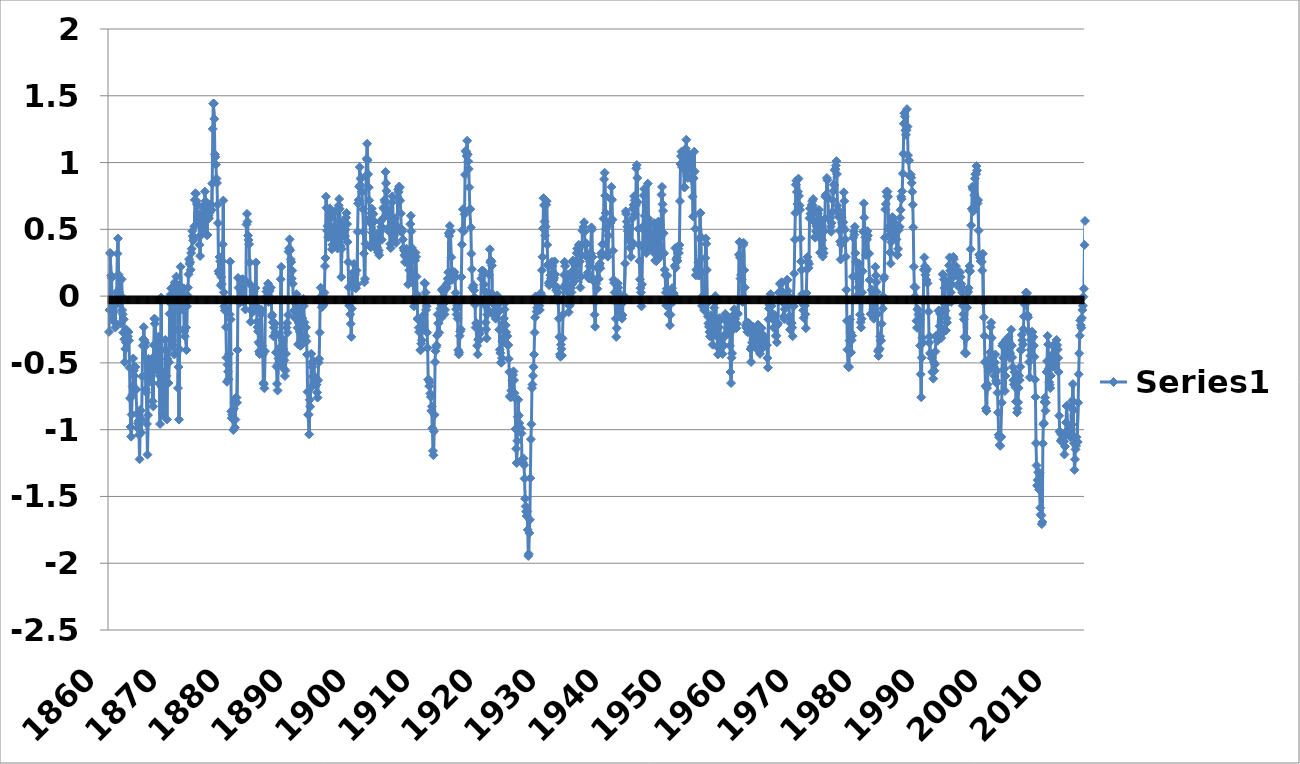
| Category | Series 0 |
|---|---|
| 1860.0 | -0.268 |
| 1860.0 | -0.105 |
| 1860.0 | 0.323 |
| 1860.0 | 0.318 |
| 1860.0 | 0.154 |
| 1860.0 | 0.136 |
| 1860.0 | -0.068 |
| 1860.0 | -0.165 |
| 1860.0 | -0.084 |
| 1860.0 | -0.12 |
| 1860.0 | -0.073 |
| 1860.0 | -0.196 |
| 1861.0 | -0.235 |
| 1861.0 | -0.039 |
| 1861.0 | 0.028 |
| 1861.0 | -0.011 |
| 1861.0 | 0.318 |
| 1861.0 | 0.432 |
| 1861.0 | 0.161 |
| 1861.0 | 0.032 |
| 1861.0 | -0.051 |
| 1861.0 | -0.021 |
| 1861.0 | -0.205 |
| 1861.0 | 0 |
| 1862.0 | 0.126 |
| 1862.0 | -0.105 |
| 1862.0 | -0.136 |
| 1862.0 | -0.273 |
| 1862.0 | -0.174 |
| 1862.0 | -0.323 |
| 1862.0 | -0.495 |
| 1862.0 | -0.395 |
| 1862.0 | -0.346 |
| 1862.0 | -0.251 |
| 1862.0 | -0.336 |
| 1862.0 | -0.328 |
| 1863.0 | -0.301 |
| 1863.0 | -0.269 |
| 1863.0 | -0.333 |
| 1863.0 | -0.536 |
| 1863.0 | -0.765 |
| 1863.0 | -0.979 |
| 1863.0 | -1.052 |
| 1863.0 | -0.887 |
| 1863.0 | -0.74 |
| 1863.0 | -0.677 |
| 1863.0 | -0.467 |
| 1863.0 | -0.557 |
| 1864.0 | -0.596 |
| 1864.0 | -0.531 |
| 1864.0 | -0.53 |
| 1864.0 | -0.7 |
| 1864.0 | -0.699 |
| 1864.0 | -0.881 |
| 1864.0 | -0.987 |
| 1864.0 | -0.953 |
| 1864.0 | -0.937 |
| 1864.0 | -1.038 |
| 1864.0 | -1.222 |
| 1864.0 | -0.853 |
| 1865.0 | -0.859 |
| 1865.0 | -1.023 |
| 1865.0 | -0.924 |
| 1865.0 | -0.601 |
| 1865.0 | -0.371 |
| 1865.0 | -0.323 |
| 1865.0 | -0.232 |
| 1865.0 | -0.329 |
| 1865.0 | -0.379 |
| 1865.0 | -0.349 |
| 1865.0 | -0.697 |
| 1865.0 | -0.721 |
| 1866.0 | -0.957 |
| 1866.0 | -1.187 |
| 1866.0 | -0.891 |
| 1866.0 | -0.47 |
| 1866.0 | -0.601 |
| 1866.0 | -0.585 |
| 1866.0 | -0.593 |
| 1866.0 | -0.559 |
| 1866.0 | -0.641 |
| 1866.0 | -0.513 |
| 1866.0 | -0.467 |
| 1866.0 | -0.787 |
| 1867.0 | -0.826 |
| 1867.0 | -0.367 |
| 1867.0 | -0.169 |
| 1867.0 | -0.207 |
| 1867.0 | -0.174 |
| 1867.0 | -0.553 |
| 1867.0 | -0.527 |
| 1867.0 | -0.428 |
| 1867.0 | -0.51 |
| 1867.0 | -0.415 |
| 1867.0 | -0.303 |
| 1867.0 | -0.656 |
| 1868.0 | -0.596 |
| 1868.0 | -0.958 |
| 1868.0 | -0.333 |
| 1868.0 | -0.011 |
| 1868.0 | -0.404 |
| 1868.0 | -0.684 |
| 1868.0 | -0.79 |
| 1868.0 | -0.887 |
| 1868.0 | -0.74 |
| 1868.0 | -0.677 |
| 1868.0 | -0.565 |
| 1868.0 | -0.328 |
| 1869.0 | -0.596 |
| 1869.0 | -0.597 |
| 1869.0 | -0.924 |
| 1869.0 | -0.47 |
| 1869.0 | -0.404 |
| 1869.0 | -0.651 |
| 1869.0 | -0.495 |
| 1869.0 | -0.133 |
| 1869.0 | -0.051 |
| 1869.0 | 0.012 |
| 1869.0 | 0.058 |
| 1869.0 | -0.36 |
| 1870.0 | -0.334 |
| 1870.0 | -0.367 |
| 1870.0 | -0.267 |
| 1870.0 | -0.24 |
| 1870.0 | -0.437 |
| 1870.0 | 0.104 |
| 1870.0 | 0.096 |
| 1870.0 | -0.001 |
| 1870.0 | 0.146 |
| 1870.0 | 0.044 |
| 1870.0 | -0.008 |
| 1870.0 | -0.689 |
| 1871.0 | -0.531 |
| 1871.0 | -0.925 |
| 1871.0 | -0.399 |
| 1871.0 | 0.022 |
| 1871.0 | 0.219 |
| 1871.0 | 0.071 |
| 1871.0 | -0.068 |
| 1871.0 | -0.1 |
| 1871.0 | -0.018 |
| 1871.0 | -0.021 |
| 1871.0 | 0.058 |
| 1871.0 | -0.262 |
| 1872.0 | -0.301 |
| 1872.0 | -0.236 |
| 1872.0 | -0.235 |
| 1872.0 | -0.404 |
| 1872.0 | -0.076 |
| 1872.0 | 0.005 |
| 1872.0 | 0.063 |
| 1872.0 | 0.163 |
| 1872.0 | 0.277 |
| 1872.0 | 0.241 |
| 1872.0 | 0.255 |
| 1872.0 | 0.197 |
| 1873.0 | 0.322 |
| 1873.0 | 0.355 |
| 1873.0 | 0.487 |
| 1873.0 | 0.449 |
| 1873.0 | 0.416 |
| 1873.0 | 0.432 |
| 1873.0 | 0.522 |
| 1873.0 | 0.721 |
| 1873.0 | 0.769 |
| 1873.0 | 0.766 |
| 1873.0 | 0.714 |
| 1873.0 | 0.689 |
| 1874.0 | 0.683 |
| 1874.0 | 0.552 |
| 1874.0 | 0.586 |
| 1874.0 | 0.613 |
| 1874.0 | 0.384 |
| 1874.0 | 0.3 |
| 1874.0 | 0.457 |
| 1874.0 | 0.458 |
| 1874.0 | 0.54 |
| 1874.0 | 0.668 |
| 1874.0 | 0.616 |
| 1874.0 | 0.558 |
| 1875.0 | 0.486 |
| 1875.0 | 0.65 |
| 1875.0 | 0.783 |
| 1875.0 | 0.711 |
| 1875.0 | 0.613 |
| 1875.0 | 0.694 |
| 1875.0 | 0.457 |
| 1875.0 | 0.458 |
| 1875.0 | 0.671 |
| 1875.0 | 0.602 |
| 1875.0 | 0.583 |
| 1875.0 | 0.624 |
| 1876.0 | 0.683 |
| 1876.0 | 0.683 |
| 1876.0 | 0.684 |
| 1876.0 | 0.646 |
| 1876.0 | 0.843 |
| 1876.0 | 1.252 |
| 1876.0 | 1.441 |
| 1876.0 | 1.442 |
| 1876.0 | 1.327 |
| 1876.0 | 1.061 |
| 1876.0 | 1.042 |
| 1876.0 | 0.985 |
| 1877.0 | 0.88 |
| 1877.0 | 0.847 |
| 1877.0 | 0.684 |
| 1877.0 | 0.547 |
| 1877.0 | 0.187 |
| 1877.0 | 0.169 |
| 1877.0 | 0.293 |
| 1877.0 | 0.261 |
| 1877.0 | 0.08 |
| 1877.0 | 0.143 |
| 1877.0 | 0.091 |
| 1877.0 | 0.263 |
| 1878.0 | 0.388 |
| 1878.0 | 0.716 |
| 1878.0 | 0.028 |
| 1878.0 | -0.076 |
| 1878.0 | -0.109 |
| 1878.0 | -0.093 |
| 1878.0 | -0.232 |
| 1878.0 | -0.461 |
| 1878.0 | -0.641 |
| 1878.0 | -0.513 |
| 1878.0 | -0.565 |
| 1878.0 | -0.623 |
| 1879.0 | -0.432 |
| 1879.0 | -0.137 |
| 1879.0 | 0.258 |
| 1879.0 | -0.175 |
| 1879.0 | -0.863 |
| 1879.0 | -0.914 |
| 1879.0 | -0.888 |
| 1879.0 | -0.854 |
| 1879.0 | -1.002 |
| 1879.0 | -0.842 |
| 1879.0 | -0.795 |
| 1879.0 | -0.984 |
| 1880.0 | -0.924 |
| 1880.0 | -0.761 |
| 1880.0 | -0.759 |
| 1880.0 | -0.798 |
| 1880.0 | -0.404 |
| 1880.0 | 0.136 |
| 1880.0 | 0.063 |
| 1880.0 | -0.034 |
| 1880.0 | -0.051 |
| 1880.0 | -0.021 |
| 1880.0 | 0.058 |
| 1880.0 | 0.033 |
| 1881.0 | 0.027 |
| 1881.0 | 0.125 |
| 1881.0 | 0.126 |
| 1881.0 | -0.043 |
| 1881.0 | -0.043 |
| 1881.0 | 0.104 |
| 1881.0 | -0.035 |
| 1881.0 | -0.1 |
| 1881.0 | 0.113 |
| 1881.0 | 0.536 |
| 1881.0 | 0.616 |
| 1881.0 | 0.558 |
| 1882.0 | 0.454 |
| 1882.0 | 0.42 |
| 1882.0 | 0.389 |
| 1882.0 | 0.252 |
| 1882.0 | 0.088 |
| 1882.0 | -0.192 |
| 1882.0 | -0.101 |
| 1882.0 | -0.034 |
| 1882.0 | -0.051 |
| 1882.0 | -0.12 |
| 1882.0 | -0.008 |
| 1882.0 | 0.033 |
| 1883.0 | 0.06 |
| 1883.0 | -0.039 |
| 1883.0 | 0.061 |
| 1883.0 | 0.252 |
| 1883.0 | -0.076 |
| 1883.0 | -0.192 |
| 1883.0 | -0.232 |
| 1883.0 | -0.264 |
| 1883.0 | -0.346 |
| 1883.0 | -0.415 |
| 1883.0 | -0.434 |
| 1883.0 | -0.36 |
| 1884.0 | -0.137 |
| 1884.0 | -0.105 |
| 1884.0 | -0.103 |
| 1884.0 | -0.371 |
| 1884.0 | -0.437 |
| 1884.0 | -0.651 |
| 1884.0 | -0.659 |
| 1884.0 | -0.69 |
| 1884.0 | -0.412 |
| 1884.0 | -0.021 |
| 1884.0 | -0.008 |
| 1884.0 | 0.033 |
| 1885.0 | 0.06 |
| 1885.0 | 0.059 |
| 1885.0 | 0.094 |
| 1885.0 | -0.043 |
| 1885.0 | 0.055 |
| 1885.0 | 0.038 |
| 1885.0 | 0.063 |
| 1885.0 | 0.064 |
| 1885.0 | -0.018 |
| 1885.0 | -0.153 |
| 1885.0 | -0.139 |
| 1885.0 | -0.196 |
| 1886.0 | -0.301 |
| 1886.0 | -0.236 |
| 1886.0 | -0.202 |
| 1886.0 | -0.207 |
| 1886.0 | -0.273 |
| 1886.0 | -0.421 |
| 1886.0 | -0.527 |
| 1886.0 | -0.657 |
| 1886.0 | -0.707 |
| 1886.0 | -0.513 |
| 1886.0 | -0.467 |
| 1886.0 | -0.393 |
| 1887.0 | -0.498 |
| 1887.0 | -0.301 |
| 1887.0 | 0.126 |
| 1887.0 | 0.219 |
| 1887.0 | -0.371 |
| 1887.0 | -0.421 |
| 1887.0 | -0.331 |
| 1887.0 | -0.395 |
| 1887.0 | -0.543 |
| 1887.0 | -0.481 |
| 1887.0 | -0.598 |
| 1887.0 | -0.557 |
| 1888.0 | -0.432 |
| 1888.0 | -0.236 |
| 1888.0 | -0.202 |
| 1888.0 | -0.273 |
| 1888.0 | -0.141 |
| 1888.0 | 0.333 |
| 1888.0 | 0.358 |
| 1888.0 | 0.425 |
| 1888.0 | 0.343 |
| 1888.0 | 0.274 |
| 1888.0 | 0.255 |
| 1888.0 | 0.132 |
| 1889.0 | 0.191 |
| 1889.0 | 0.092 |
| 1889.0 | -0.038 |
| 1889.0 | -0.109 |
| 1889.0 | -0.043 |
| 1889.0 | -0.159 |
| 1889.0 | -0.167 |
| 1889.0 | -0.1 |
| 1889.0 | 0.015 |
| 1889.0 | -0.087 |
| 1889.0 | -0.237 |
| 1889.0 | -0.36 |
| 1890.0 | -0.203 |
| 1890.0 | -0.105 |
| 1890.0 | -0.267 |
| 1890.0 | -0.371 |
| 1890.0 | -0.371 |
| 1890.0 | -0.323 |
| 1890.0 | -0.199 |
| 1890.0 | -0.165 |
| 1890.0 | -0.051 |
| 1890.0 | -0.021 |
| 1890.0 | -0.073 |
| 1890.0 | -0.196 |
| 1891.0 | -0.334 |
| 1891.0 | -0.301 |
| 1891.0 | -0.235 |
| 1891.0 | -0.339 |
| 1891.0 | -0.437 |
| 1891.0 | -0.717 |
| 1891.0 | -0.888 |
| 1891.0 | -0.887 |
| 1891.0 | -1.035 |
| 1891.0 | -0.776 |
| 1891.0 | -0.828 |
| 1891.0 | -0.689 |
| 1892.0 | -0.432 |
| 1892.0 | -0.498 |
| 1892.0 | -0.53 |
| 1892.0 | -0.601 |
| 1892.0 | -0.601 |
| 1892.0 | -0.487 |
| 1892.0 | -0.659 |
| 1892.0 | -0.657 |
| 1892.0 | -0.609 |
| 1892.0 | -0.645 |
| 1892.0 | -0.664 |
| 1892.0 | -0.721 |
| 1893.0 | -0.76 |
| 1893.0 | -0.629 |
| 1893.0 | -0.497 |
| 1893.0 | -0.47 |
| 1893.0 | -0.273 |
| 1893.0 | -0.028 |
| 1893.0 | 0.063 |
| 1893.0 | -0.001 |
| 1893.0 | -0.084 |
| 1893.0 | -0.054 |
| 1893.0 | -0.073 |
| 1893.0 | -0.065 |
| 1894.0 | -0.006 |
| 1894.0 | 0.027 |
| 1894.0 | 0.225 |
| 1894.0 | 0.285 |
| 1894.0 | 0.744 |
| 1894.0 | 0.661 |
| 1894.0 | 0.49 |
| 1894.0 | 0.524 |
| 1894.0 | 0.441 |
| 1894.0 | 0.536 |
| 1894.0 | 0.648 |
| 1894.0 | 0.657 |
| 1895.0 | 0.618 |
| 1895.0 | 0.584 |
| 1895.0 | 0.52 |
| 1895.0 | 0.35 |
| 1895.0 | 0.384 |
| 1895.0 | 0.432 |
| 1895.0 | 0.424 |
| 1895.0 | 0.392 |
| 1895.0 | 0.507 |
| 1895.0 | 0.635 |
| 1895.0 | 0.484 |
| 1895.0 | 0.394 |
| 1896.0 | 0.454 |
| 1896.0 | 0.453 |
| 1896.0 | 0.356 |
| 1896.0 | 0.383 |
| 1896.0 | 0.679 |
| 1896.0 | 0.727 |
| 1896.0 | 0.654 |
| 1896.0 | 0.556 |
| 1896.0 | 0.376 |
| 1896.0 | 0.143 |
| 1896.0 | 0.353 |
| 1896.0 | 0.46 |
| 1897.0 | 0.519 |
| 1897.0 | 0.486 |
| 1897.0 | 0.52 |
| 1897.0 | 0.449 |
| 1897.0 | 0.449 |
| 1897.0 | 0.497 |
| 1897.0 | 0.588 |
| 1897.0 | 0.622 |
| 1897.0 | 0.54 |
| 1897.0 | 0.405 |
| 1897.0 | 0.255 |
| 1897.0 | 0.066 |
| 1898.0 | -0.071 |
| 1898.0 | -0.039 |
| 1898.0 | -0.136 |
| 1898.0 | -0.207 |
| 1898.0 | -0.305 |
| 1898.0 | -0.093 |
| 1898.0 | 0.096 |
| 1898.0 | 0.13 |
| 1898.0 | 0.179 |
| 1898.0 | 0.241 |
| 1898.0 | 0.156 |
| 1898.0 | 0.164 |
| 1899.0 | 0.06 |
| 1899.0 | 0.059 |
| 1899.0 | 0.192 |
| 1899.0 | 0.088 |
| 1899.0 | 0.482 |
| 1899.0 | 0.694 |
| 1899.0 | 0.719 |
| 1899.0 | 0.819 |
| 1899.0 | 0.966 |
| 1899.0 | 0.832 |
| 1899.0 | 0.878 |
| 1899.0 | 0.886 |
| 1900.0 | 0.782 |
| 1900.0 | 0.781 |
| 1900.0 | 0.651 |
| 1900.0 | 0.482 |
| 1900.0 | 0.318 |
| 1900.0 | 0.104 |
| 1900.0 | 0.129 |
| 1900.0 | 0.392 |
| 1900.0 | 0.901 |
| 1900.0 | 1.029 |
| 1900.0 | 1.141 |
| 1900.0 | 1.017 |
| 1901.0 | 0.913 |
| 1901.0 | 0.814 |
| 1901.0 | 0.717 |
| 1901.0 | 0.58 |
| 1901.0 | 0.548 |
| 1901.0 | 0.366 |
| 1901.0 | 0.621 |
| 1901.0 | 0.655 |
| 1901.0 | 0.474 |
| 1901.0 | 0.569 |
| 1901.0 | 0.616 |
| 1901.0 | 0.558 |
| 1902.0 | 0.454 |
| 1902.0 | 0.42 |
| 1902.0 | 0.389 |
| 1902.0 | 0.383 |
| 1902.0 | 0.351 |
| 1902.0 | 0.366 |
| 1902.0 | 0.424 |
| 1902.0 | 0.327 |
| 1902.0 | 0.343 |
| 1902.0 | 0.307 |
| 1902.0 | 0.484 |
| 1902.0 | 0.558 |
| 1903.0 | 0.486 |
| 1903.0 | 0.519 |
| 1903.0 | 0.422 |
| 1903.0 | 0.514 |
| 1903.0 | 0.58 |
| 1903.0 | 0.661 |
| 1903.0 | 0.654 |
| 1903.0 | 0.721 |
| 1903.0 | 0.704 |
| 1903.0 | 0.93 |
| 1903.0 | 0.845 |
| 1903.0 | 0.788 |
| 1904.0 | 0.618 |
| 1904.0 | 0.617 |
| 1904.0 | 0.651 |
| 1904.0 | 0.514 |
| 1904.0 | 0.482 |
| 1904.0 | 0.497 |
| 1904.0 | 0.391 |
| 1904.0 | 0.36 |
| 1904.0 | 0.474 |
| 1904.0 | 0.7 |
| 1904.0 | 0.747 |
| 1904.0 | 0.591 |
| 1905.0 | 0.585 |
| 1905.0 | 0.42 |
| 1905.0 | 0.454 |
| 1905.0 | 0.58 |
| 1905.0 | 0.482 |
| 1905.0 | 0.399 |
| 1905.0 | 0.49 |
| 1905.0 | 0.524 |
| 1905.0 | 0.736 |
| 1905.0 | 0.799 |
| 1905.0 | 0.78 |
| 1905.0 | 0.821 |
| 1906.0 | 0.814 |
| 1906.0 | 0.716 |
| 1906.0 | 0.618 |
| 1906.0 | 0.482 |
| 1906.0 | 0.482 |
| 1906.0 | 0.497 |
| 1906.0 | 0.424 |
| 1906.0 | 0.36 |
| 1906.0 | 0.343 |
| 1906.0 | 0.307 |
| 1906.0 | 0.255 |
| 1906.0 | 0.296 |
| 1907.0 | 0.322 |
| 1907.0 | 0.355 |
| 1907.0 | 0.323 |
| 1907.0 | 0.252 |
| 1907.0 | 0.088 |
| 1907.0 | 0.268 |
| 1907.0 | 0.194 |
| 1907.0 | 0.327 |
| 1907.0 | 0.54 |
| 1907.0 | 0.602 |
| 1907.0 | 0.484 |
| 1907.0 | 0.361 |
| 1908.0 | 0.158 |
| 1908.0 | 0.125 |
| 1908.0 | 0.094 |
| 1908.0 | -0.076 |
| 1908.0 | -0.01 |
| 1908.0 | 0.268 |
| 1908.0 | 0.326 |
| 1908.0 | 0.294 |
| 1908.0 | 0.146 |
| 1908.0 | 0.012 |
| 1908.0 | -0.172 |
| 1908.0 | -0.164 |
| 1909.0 | -0.235 |
| 1909.0 | -0.269 |
| 1909.0 | -0.267 |
| 1909.0 | -0.404 |
| 1909.0 | -0.404 |
| 1909.0 | -0.356 |
| 1909.0 | -0.331 |
| 1909.0 | -0.198 |
| 1909.0 | -0.215 |
| 1909.0 | -0.251 |
| 1909.0 | -0.139 |
| 1909.0 | 0.099 |
| 1910.0 | 0.093 |
| 1910.0 | 0.027 |
| 1910.0 | -0.103 |
| 1910.0 | -0.076 |
| 1910.0 | -0.273 |
| 1910.0 | -0.389 |
| 1910.0 | -0.626 |
| 1910.0 | -0.625 |
| 1910.0 | -0.674 |
| 1910.0 | -0.645 |
| 1910.0 | -0.729 |
| 1910.0 | -0.754 |
| 1911.0 | -0.859 |
| 1911.0 | -0.826 |
| 1911.0 | -0.989 |
| 1911.0 | -1.159 |
| 1911.0 | -1.191 |
| 1911.0 | -1.012 |
| 1911.0 | -0.888 |
| 1911.0 | -0.493 |
| 1911.0 | -0.412 |
| 1911.0 | -0.382 |
| 1911.0 | -0.369 |
| 1911.0 | -0.295 |
| 1912.0 | -0.137 |
| 1912.0 | -0.203 |
| 1912.0 | -0.202 |
| 1912.0 | -0.273 |
| 1912.0 | -0.141 |
| 1912.0 | -0.093 |
| 1912.0 | -0.167 |
| 1912.0 | -0.067 |
| 1912.0 | 0.048 |
| 1912.0 | 0.044 |
| 1912.0 | 0.058 |
| 1912.0 | 0.033 |
| 1913.0 | -0.039 |
| 1913.0 | -0.137 |
| 1913.0 | -0.103 |
| 1913.0 | -0.043 |
| 1913.0 | 0.055 |
| 1913.0 | 0.071 |
| 1913.0 | 0.096 |
| 1913.0 | 0.13 |
| 1913.0 | 0.179 |
| 1913.0 | 0.471 |
| 1913.0 | 0.452 |
| 1913.0 | 0.525 |
| 1914.0 | 0.486 |
| 1914.0 | 0.486 |
| 1914.0 | 0.29 |
| 1914.0 | 0.121 |
| 1914.0 | 0.187 |
| 1914.0 | 0.136 |
| 1914.0 | 0.161 |
| 1914.0 | 0.13 |
| 1914.0 | 0.179 |
| 1914.0 | 0.143 |
| 1914.0 | 0.025 |
| 1914.0 | -0.098 |
| 1915.0 | -0.137 |
| 1915.0 | -0.072 |
| 1915.0 | -0.169 |
| 1915.0 | -0.404 |
| 1915.0 | -0.437 |
| 1915.0 | -0.421 |
| 1915.0 | -0.298 |
| 1915.0 | -0.264 |
| 1915.0 | -0.248 |
| 1915.0 | 0.143 |
| 1915.0 | 0.386 |
| 1915.0 | 0.493 |
| 1916.0 | 0.65 |
| 1916.0 | 0.65 |
| 1916.0 | 0.487 |
| 1916.0 | 0.613 |
| 1916.0 | 0.908 |
| 1916.0 | 1.088 |
| 1916.0 | 1.08 |
| 1916.0 | 1.049 |
| 1916.0 | 1.163 |
| 1916.0 | 1.061 |
| 1916.0 | 1.009 |
| 1916.0 | 0.952 |
| 1917.0 | 0.814 |
| 1917.0 | 0.65 |
| 1917.0 | 0.651 |
| 1917.0 | 0.514 |
| 1917.0 | 0.318 |
| 1917.0 | 0.202 |
| 1917.0 | 0.063 |
| 1917.0 | 0.064 |
| 1917.0 | 0.08 |
| 1917.0 | 0.044 |
| 1917.0 | -0.008 |
| 1917.0 | -0.065 |
| 1918.0 | -0.235 |
| 1918.0 | -0.203 |
| 1918.0 | -0.202 |
| 1918.0 | -0.371 |
| 1918.0 | -0.437 |
| 1918.0 | -0.323 |
| 1918.0 | -0.331 |
| 1918.0 | -0.329 |
| 1918.0 | -0.281 |
| 1918.0 | -0.251 |
| 1918.0 | -0.04 |
| 1918.0 | 0.132 |
| 1919.0 | 0.191 |
| 1919.0 | 0.191 |
| 1919.0 | 0.159 |
| 1919.0 | 0.186 |
| 1919.0 | 0.088 |
| 1919.0 | 0.038 |
| 1919.0 | -0.068 |
| 1919.0 | -0.198 |
| 1919.0 | -0.248 |
| 1919.0 | -0.317 |
| 1919.0 | -0.139 |
| 1919.0 | -0.032 |
| 1920.0 | -0.104 |
| 1920.0 | 0.027 |
| 1920.0 | 0.159 |
| 1920.0 | 0.35 |
| 1920.0 | 0.252 |
| 1920.0 | 0.268 |
| 1920.0 | 0.26 |
| 1920.0 | 0.228 |
| 1920.0 | 0.015 |
| 1920.0 | -0.054 |
| 1920.0 | -0.139 |
| 1920.0 | -0.131 |
| 1921.0 | -0.039 |
| 1921.0 | -0.137 |
| 1921.0 | -0.169 |
| 1921.0 | -0.076 |
| 1921.0 | -0.01 |
| 1921.0 | 0.005 |
| 1921.0 | -0.068 |
| 1921.0 | -0.1 |
| 1921.0 | -0.117 |
| 1921.0 | -0.251 |
| 1921.0 | -0.401 |
| 1921.0 | -0.426 |
| 1922.0 | -0.498 |
| 1922.0 | -0.498 |
| 1922.0 | -0.464 |
| 1922.0 | -0.339 |
| 1922.0 | -0.207 |
| 1922.0 | -0.257 |
| 1922.0 | -0.167 |
| 1922.0 | -0.1 |
| 1922.0 | -0.051 |
| 1922.0 | -0.218 |
| 1922.0 | -0.27 |
| 1922.0 | -0.295 |
| 1923.0 | -0.301 |
| 1923.0 | -0.367 |
| 1923.0 | -0.366 |
| 1923.0 | -0.47 |
| 1923.0 | -0.568 |
| 1923.0 | -0.749 |
| 1923.0 | -0.757 |
| 1923.0 | -0.756 |
| 1923.0 | -0.707 |
| 1923.0 | -0.71 |
| 1923.0 | -0.631 |
| 1923.0 | -0.59 |
| 1924.0 | -0.563 |
| 1924.0 | -0.629 |
| 1924.0 | -0.727 |
| 1924.0 | -0.765 |
| 1924.0 | -0.994 |
| 1924.0 | -1.143 |
| 1924.0 | -1.249 |
| 1924.0 | -1.084 |
| 1924.0 | -0.904 |
| 1924.0 | -0.776 |
| 1924.0 | -0.893 |
| 1924.0 | -0.951 |
| 1925.0 | -0.99 |
| 1925.0 | -0.99 |
| 1925.0 | -0.989 |
| 1925.0 | -1.028 |
| 1925.0 | -1.224 |
| 1925.0 | -1.242 |
| 1925.0 | -1.249 |
| 1925.0 | -1.215 |
| 1925.0 | -1.265 |
| 1925.0 | -1.366 |
| 1925.0 | -1.517 |
| 1925.0 | -1.574 |
| 1926.0 | -1.613 |
| 1926.0 | -1.647 |
| 1926.0 | -1.612 |
| 1926.0 | -1.749 |
| 1926.0 | -1.946 |
| 1926.0 | -1.931 |
| 1926.0 | -1.774 |
| 1926.0 | -1.675 |
| 1926.0 | -1.363 |
| 1926.0 | -1.071 |
| 1926.0 | -0.959 |
| 1926.0 | -0.689 |
| 1927.0 | -0.662 |
| 1927.0 | -0.597 |
| 1927.0 | -0.53 |
| 1927.0 | -0.437 |
| 1927.0 | -0.273 |
| 1927.0 | -0.159 |
| 1927.0 | -0.003 |
| 1927.0 | -0.034 |
| 1927.0 | -0.117 |
| 1927.0 | -0.087 |
| 1927.0 | -0.106 |
| 1927.0 | -0.065 |
| 1928.0 | -0.039 |
| 1928.0 | -0.072 |
| 1928.0 | -0.103 |
| 1928.0 | -0.011 |
| 1928.0 | 0.023 |
| 1928.0 | 0.005 |
| 1928.0 | 0.194 |
| 1928.0 | 0.294 |
| 1928.0 | 0.507 |
| 1928.0 | 0.733 |
| 1928.0 | 0.681 |
| 1928.0 | 0.558 |
| 1929.0 | 0.454 |
| 1929.0 | 0.519 |
| 1929.0 | 0.684 |
| 1929.0 | 0.711 |
| 1929.0 | 0.384 |
| 1929.0 | 0.235 |
| 1929.0 | 0.227 |
| 1929.0 | 0.097 |
| 1929.0 | 0.08 |
| 1929.0 | 0.11 |
| 1929.0 | 0.156 |
| 1929.0 | 0.132 |
| 1930.0 | 0.158 |
| 1930.0 | 0.256 |
| 1930.0 | 0.225 |
| 1930.0 | 0.088 |
| 1930.0 | 0.121 |
| 1930.0 | 0.136 |
| 1930.0 | 0.26 |
| 1930.0 | 0.163 |
| 1930.0 | -0.018 |
| 1930.0 | 0.044 |
| 1930.0 | -0.008 |
| 1930.0 | 0.066 |
| 1931.0 | 0.027 |
| 1931.0 | -0.039 |
| 1931.0 | -0.169 |
| 1931.0 | -0.306 |
| 1931.0 | -0.437 |
| 1931.0 | -0.454 |
| 1931.0 | -0.363 |
| 1931.0 | -0.395 |
| 1931.0 | -0.445 |
| 1931.0 | -0.317 |
| 1931.0 | -0.139 |
| 1931.0 | 0.066 |
| 1932.0 | 0.158 |
| 1932.0 | 0.256 |
| 1932.0 | 0.225 |
| 1932.0 | 0.088 |
| 1932.0 | 0.088 |
| 1932.0 | 0.038 |
| 1932.0 | 0.063 |
| 1932.0 | 0.163 |
| 1932.0 | 0.146 |
| 1932.0 | -0.12 |
| 1932.0 | -0.073 |
| 1932.0 | -0.065 |
| 1933.0 | -0.006 |
| 1933.0 | 0.059 |
| 1933.0 | 0.028 |
| 1933.0 | 0.088 |
| 1933.0 | 0.252 |
| 1933.0 | 0.268 |
| 1933.0 | 0.194 |
| 1933.0 | 0.13 |
| 1933.0 | 0.113 |
| 1933.0 | 0.176 |
| 1933.0 | 0.189 |
| 1933.0 | 0.23 |
| 1934.0 | 0.322 |
| 1934.0 | 0.355 |
| 1934.0 | 0.356 |
| 1934.0 | 0.35 |
| 1934.0 | 0.384 |
| 1934.0 | 0.366 |
| 1934.0 | 0.26 |
| 1934.0 | 0.064 |
| 1934.0 | 0.146 |
| 1934.0 | 0.307 |
| 1934.0 | 0.386 |
| 1934.0 | 0.493 |
| 1935.0 | 0.486 |
| 1935.0 | 0.519 |
| 1935.0 | 0.553 |
| 1935.0 | 0.482 |
| 1935.0 | 0.384 |
| 1935.0 | 0.3 |
| 1935.0 | 0.391 |
| 1935.0 | 0.392 |
| 1935.0 | 0.31 |
| 1935.0 | 0.176 |
| 1935.0 | 0.156 |
| 1935.0 | 0.132 |
| 1936.0 | 0.224 |
| 1936.0 | 0.256 |
| 1936.0 | 0.323 |
| 1936.0 | 0.318 |
| 1936.0 | 0.515 |
| 1936.0 | 0.497 |
| 1936.0 | 0.293 |
| 1936.0 | 0.13 |
| 1936.0 | 0.113 |
| 1936.0 | -0.021 |
| 1936.0 | -0.139 |
| 1936.0 | -0.229 |
| 1937.0 | -0.039 |
| 1937.0 | 0.092 |
| 1937.0 | 0.126 |
| 1937.0 | 0.055 |
| 1937.0 | 0.219 |
| 1937.0 | 0.202 |
| 1937.0 | 0.129 |
| 1937.0 | 0.228 |
| 1937.0 | 0.244 |
| 1937.0 | 0.208 |
| 1937.0 | 0.32 |
| 1937.0 | 0.296 |
| 1938.0 | 0.322 |
| 1938.0 | 0.388 |
| 1938.0 | 0.389 |
| 1938.0 | 0.58 |
| 1938.0 | 0.876 |
| 1938.0 | 0.924 |
| 1938.0 | 0.752 |
| 1938.0 | 0.622 |
| 1938.0 | 0.507 |
| 1938.0 | 0.307 |
| 1938.0 | 0.32 |
| 1938.0 | 0.296 |
| 1939.0 | 0.454 |
| 1939.0 | 0.552 |
| 1939.0 | 0.553 |
| 1939.0 | 0.547 |
| 1939.0 | 0.548 |
| 1939.0 | 0.727 |
| 1939.0 | 0.818 |
| 1939.0 | 0.721 |
| 1939.0 | 0.572 |
| 1939.0 | 0.34 |
| 1939.0 | 0.124 |
| 1939.0 | 0.099 |
| 1940.0 | 0.027 |
| 1940.0 | -0.039 |
| 1940.0 | -0.169 |
| 1940.0 | -0.306 |
| 1940.0 | -0.24 |
| 1940.0 | 0.038 |
| 1940.0 | 0.096 |
| 1940.0 | 0.064 |
| 1940.0 | -0.018 |
| 1940.0 | -0.12 |
| 1940.0 | -0.04 |
| 1940.0 | -0.032 |
| 1941.0 | -0.006 |
| 1941.0 | -0.039 |
| 1941.0 | -0.169 |
| 1941.0 | -0.142 |
| 1941.0 | -0.043 |
| 1941.0 | 0.005 |
| 1941.0 | -0.035 |
| 1941.0 | -0.034 |
| 1941.0 | 0.244 |
| 1941.0 | 0.635 |
| 1941.0 | 0.616 |
| 1941.0 | 0.558 |
| 1942.0 | 0.519 |
| 1942.0 | 0.486 |
| 1942.0 | 0.487 |
| 1942.0 | 0.416 |
| 1942.0 | 0.515 |
| 1942.0 | 0.497 |
| 1942.0 | 0.358 |
| 1942.0 | 0.294 |
| 1942.0 | 0.376 |
| 1942.0 | 0.405 |
| 1942.0 | 0.583 |
| 1942.0 | 0.657 |
| 1943.0 | 0.683 |
| 1943.0 | 0.748 |
| 1943.0 | 0.717 |
| 1943.0 | 0.613 |
| 1943.0 | 0.679 |
| 1943.0 | 0.957 |
| 1943.0 | 0.982 |
| 1943.0 | 0.885 |
| 1943.0 | 0.704 |
| 1943.0 | 0.504 |
| 1943.0 | 0.386 |
| 1943.0 | 0.263 |
| 1944.0 | 0.126 |
| 1944.0 | 0.059 |
| 1944.0 | 0.028 |
| 1944.0 | -0.076 |
| 1944.0 | 0.088 |
| 1944.0 | 0.366 |
| 1944.0 | 0.522 |
| 1944.0 | 0.753 |
| 1944.0 | 0.802 |
| 1944.0 | 0.602 |
| 1944.0 | 0.484 |
| 1944.0 | 0.394 |
| 1945.0 | 0.322 |
| 1945.0 | 0.388 |
| 1945.0 | 0.487 |
| 1945.0 | 0.842 |
| 1945.0 | 0.58 |
| 1945.0 | 0.399 |
| 1945.0 | 0.424 |
| 1945.0 | 0.392 |
| 1945.0 | 0.54 |
| 1945.0 | 0.405 |
| 1945.0 | 0.353 |
| 1945.0 | 0.394 |
| 1946.0 | 0.421 |
| 1946.0 | 0.453 |
| 1946.0 | 0.422 |
| 1946.0 | 0.547 |
| 1946.0 | 0.318 |
| 1946.0 | 0.268 |
| 1946.0 | 0.326 |
| 1946.0 | 0.261 |
| 1946.0 | 0.277 |
| 1946.0 | 0.34 |
| 1946.0 | 0.517 |
| 1946.0 | 0.558 |
| 1947.0 | 0.486 |
| 1947.0 | 0.388 |
| 1947.0 | 0.29 |
| 1947.0 | 0.35 |
| 1947.0 | 0.449 |
| 1947.0 | 0.76 |
| 1947.0 | 0.818 |
| 1947.0 | 0.688 |
| 1947.0 | 0.638 |
| 1947.0 | 0.471 |
| 1947.0 | 0.32 |
| 1947.0 | 0.197 |
| 1948.0 | 0.158 |
| 1948.0 | 0.027 |
| 1948.0 | -0.07 |
| 1948.0 | 0.055 |
| 1948.0 | 0.154 |
| 1948.0 | -0.061 |
| 1948.0 | -0.134 |
| 1948.0 | -0.067 |
| 1948.0 | -0.018 |
| 1948.0 | -0.218 |
| 1948.0 | -0.139 |
| 1948.0 | 0 |
| 1949.0 | 0.027 |
| 1949.0 | 0.059 |
| 1949.0 | -0.038 |
| 1949.0 | -0.043 |
| 1949.0 | 0.023 |
| 1949.0 | 0.005 |
| 1949.0 | 0.227 |
| 1949.0 | 0.36 |
| 1949.0 | 0.212 |
| 1949.0 | 0.274 |
| 1949.0 | 0.288 |
| 1949.0 | 0.263 |
| 1950.0 | 0.322 |
| 1950.0 | 0.355 |
| 1950.0 | 0.323 |
| 1950.0 | 0.383 |
| 1950.0 | 0.712 |
| 1950.0 | 0.989 |
| 1950.0 | 1.047 |
| 1950.0 | 1.081 |
| 1950.0 | 0.966 |
| 1950.0 | 0.996 |
| 1950.0 | 0.977 |
| 1950.0 | 0.952 |
| 1951.0 | 0.814 |
| 1951.0 | 0.814 |
| 1951.0 | 0.947 |
| 1951.0 | 1.105 |
| 1951.0 | 1.171 |
| 1951.0 | 1.022 |
| 1951.0 | 0.982 |
| 1951.0 | 0.885 |
| 1951.0 | 0.966 |
| 1951.0 | 1.061 |
| 1951.0 | 1.042 |
| 1951.0 | 0.985 |
| 1952.0 | 1.011 |
| 1952.0 | 0.978 |
| 1952.0 | 0.881 |
| 1952.0 | 0.875 |
| 1952.0 | 0.744 |
| 1952.0 | 0.596 |
| 1952.0 | 0.883 |
| 1952.0 | 1.081 |
| 1952.0 | 0.933 |
| 1952.0 | 0.504 |
| 1952.0 | 0.156 |
| 1952.0 | 0.197 |
| 1953.0 | 0.158 |
| 1953.0 | 0.191 |
| 1953.0 | 0.159 |
| 1953.0 | 0.252 |
| 1953.0 | 0.154 |
| 1953.0 | 0.432 |
| 1953.0 | 0.621 |
| 1953.0 | 0.622 |
| 1953.0 | 0.441 |
| 1953.0 | 0.176 |
| 1953.0 | -0.073 |
| 1953.0 | 0 |
| 1954.0 | -0.039 |
| 1954.0 | -0.039 |
| 1954.0 | -0.103 |
| 1954.0 | -0.109 |
| 1954.0 | 0.285 |
| 1954.0 | 0.432 |
| 1954.0 | 0.391 |
| 1954.0 | 0.196 |
| 1954.0 | -0.051 |
| 1954.0 | -0.153 |
| 1954.0 | -0.205 |
| 1954.0 | -0.229 |
| 1955.0 | -0.268 |
| 1955.0 | -0.301 |
| 1955.0 | -0.235 |
| 1955.0 | -0.142 |
| 1955.0 | -0.174 |
| 1955.0 | -0.225 |
| 1955.0 | -0.363 |
| 1955.0 | -0.198 |
| 1955.0 | -0.281 |
| 1955.0 | -0.087 |
| 1955.0 | -0.008 |
| 1955.0 | 0 |
| 1956.0 | -0.039 |
| 1956.0 | -0.039 |
| 1956.0 | -0.235 |
| 1956.0 | -0.306 |
| 1956.0 | -0.437 |
| 1956.0 | -0.389 |
| 1956.0 | -0.232 |
| 1956.0 | -0.165 |
| 1956.0 | -0.182 |
| 1956.0 | -0.317 |
| 1956.0 | -0.336 |
| 1956.0 | -0.328 |
| 1957.0 | -0.367 |
| 1957.0 | -0.433 |
| 1957.0 | -0.366 |
| 1957.0 | -0.371 |
| 1957.0 | -0.305 |
| 1957.0 | -0.29 |
| 1957.0 | -0.134 |
| 1957.0 | -0.165 |
| 1957.0 | -0.182 |
| 1957.0 | -0.284 |
| 1957.0 | -0.237 |
| 1957.0 | -0.196 |
| 1958.0 | -0.203 |
| 1958.0 | -0.17 |
| 1958.0 | -0.235 |
| 1958.0 | -0.371 |
| 1958.0 | -0.568 |
| 1958.0 | -0.651 |
| 1958.0 | -0.462 |
| 1958.0 | -0.428 |
| 1958.0 | -0.215 |
| 1958.0 | -0.251 |
| 1958.0 | -0.139 |
| 1958.0 | -0.098 |
| 1959.0 | -0.137 |
| 1959.0 | -0.17 |
| 1959.0 | -0.136 |
| 1959.0 | -0.24 |
| 1959.0 | -0.207 |
| 1959.0 | -0.126 |
| 1959.0 | -0.134 |
| 1959.0 | -0.034 |
| 1959.0 | 0.31 |
| 1959.0 | 0.405 |
| 1959.0 | 0.288 |
| 1959.0 | 0.132 |
| 1960.0 | 0.158 |
| 1960.0 | 0.125 |
| 1960.0 | -0.038 |
| 1960.0 | -0.043 |
| 1960.0 | 0.384 |
| 1960.0 | 0.399 |
| 1960.0 | 0.194 |
| 1960.0 | 0.064 |
| 1960.0 | -0.018 |
| 1960.0 | -0.218 |
| 1960.0 | -0.237 |
| 1960.0 | -0.196 |
| 1961.0 | -0.268 |
| 1961.0 | -0.269 |
| 1961.0 | -0.202 |
| 1961.0 | -0.207 |
| 1961.0 | -0.207 |
| 1961.0 | -0.257 |
| 1961.0 | -0.396 |
| 1961.0 | -0.493 |
| 1961.0 | -0.379 |
| 1961.0 | -0.349 |
| 1961.0 | -0.27 |
| 1961.0 | -0.229 |
| 1962.0 | -0.268 |
| 1962.0 | -0.269 |
| 1962.0 | -0.267 |
| 1962.0 | -0.339 |
| 1962.0 | -0.338 |
| 1962.0 | -0.29 |
| 1962.0 | -0.396 |
| 1962.0 | -0.395 |
| 1962.0 | -0.215 |
| 1962.0 | -0.218 |
| 1962.0 | -0.401 |
| 1962.0 | -0.393 |
| 1963.0 | -0.432 |
| 1963.0 | -0.4 |
| 1963.0 | -0.399 |
| 1963.0 | -0.24 |
| 1963.0 | -0.371 |
| 1963.0 | -0.29 |
| 1963.0 | -0.298 |
| 1963.0 | -0.297 |
| 1963.0 | -0.313 |
| 1963.0 | -0.349 |
| 1963.0 | -0.369 |
| 1963.0 | -0.36 |
| 1964.0 | -0.367 |
| 1964.0 | -0.367 |
| 1964.0 | -0.464 |
| 1964.0 | -0.536 |
| 1964.0 | -0.174 |
| 1964.0 | -0.093 |
| 1964.0 | -0.068 |
| 1964.0 | -0.067 |
| 1964.0 | 0.015 |
| 1964.0 | -0.021 |
| 1964.0 | -0.073 |
| 1964.0 | -0.131 |
| 1965.0 | -0.137 |
| 1965.0 | -0.17 |
| 1965.0 | -0.235 |
| 1965.0 | -0.24 |
| 1965.0 | -0.141 |
| 1965.0 | -0.192 |
| 1965.0 | -0.298 |
| 1965.0 | -0.297 |
| 1965.0 | -0.346 |
| 1965.0 | -0.218 |
| 1965.0 | -0.205 |
| 1965.0 | -0.032 |
| 1966.0 | 0.027 |
| 1966.0 | 0.027 |
| 1966.0 | 0.094 |
| 1966.0 | 0.088 |
| 1966.0 | 0.023 |
| 1966.0 | 0.104 |
| 1966.0 | -0.035 |
| 1966.0 | 0.032 |
| 1966.0 | -0.051 |
| 1966.0 | -0.153 |
| 1966.0 | -0.172 |
| 1966.0 | -0.098 |
| 1967.0 | -0.039 |
| 1967.0 | -0.006 |
| 1967.0 | -0.07 |
| 1967.0 | 0.121 |
| 1967.0 | 0.121 |
| 1967.0 | 0.038 |
| 1967.0 | -0.003 |
| 1967.0 | -0.001 |
| 1967.0 | -0.149 |
| 1967.0 | -0.251 |
| 1967.0 | -0.205 |
| 1967.0 | -0.196 |
| 1968.0 | -0.203 |
| 1968.0 | -0.236 |
| 1968.0 | -0.3 |
| 1968.0 | -0.076 |
| 1968.0 | -0.076 |
| 1968.0 | 0.169 |
| 1968.0 | 0.424 |
| 1968.0 | 0.622 |
| 1968.0 | 0.835 |
| 1968.0 | 0.865 |
| 1968.0 | 0.78 |
| 1968.0 | 0.689 |
| 1969.0 | 0.782 |
| 1969.0 | 0.88 |
| 1969.0 | 0.75 |
| 1969.0 | 0.678 |
| 1969.0 | 0.646 |
| 1969.0 | 0.432 |
| 1969.0 | 0.26 |
| 1969.0 | 0.196 |
| 1969.0 | 0.015 |
| 1969.0 | -0.054 |
| 1969.0 | -0.106 |
| 1969.0 | -0.164 |
| 1970.0 | -0.071 |
| 1970.0 | -0.072 |
| 1970.0 | -0.136 |
| 1970.0 | -0.24 |
| 1970.0 | 0.023 |
| 1970.0 | 0.202 |
| 1970.0 | 0.293 |
| 1970.0 | 0.261 |
| 1970.0 | 0.212 |
| 1970.0 | 0.241 |
| 1970.0 | 0.583 |
| 1970.0 | 0.657 |
| 1971.0 | 0.618 |
| 1971.0 | 0.617 |
| 1971.0 | 0.684 |
| 1971.0 | 0.711 |
| 1971.0 | 0.679 |
| 1971.0 | 0.727 |
| 1971.0 | 0.654 |
| 1971.0 | 0.556 |
| 1971.0 | 0.441 |
| 1971.0 | 0.438 |
| 1971.0 | 0.484 |
| 1971.0 | 0.525 |
| 1972.0 | 0.519 |
| 1972.0 | 0.519 |
| 1972.0 | 0.618 |
| 1972.0 | 0.58 |
| 1972.0 | 0.646 |
| 1972.0 | 0.464 |
| 1972.0 | 0.326 |
| 1972.0 | 0.491 |
| 1972.0 | 0.572 |
| 1972.0 | 0.536 |
| 1972.0 | 0.419 |
| 1972.0 | 0.296 |
| 1973.0 | 0.355 |
| 1973.0 | 0.322 |
| 1973.0 | 0.487 |
| 1973.0 | 0.58 |
| 1973.0 | 0.744 |
| 1973.0 | 0.76 |
| 1973.0 | 0.752 |
| 1973.0 | 0.885 |
| 1973.0 | 0.868 |
| 1973.0 | 0.733 |
| 1973.0 | 0.583 |
| 1973.0 | 0.591 |
| 1974.0 | 0.585 |
| 1974.0 | 0.584 |
| 1974.0 | 0.52 |
| 1974.0 | 0.482 |
| 1974.0 | 0.548 |
| 1974.0 | 0.628 |
| 1974.0 | 0.719 |
| 1974.0 | 0.786 |
| 1974.0 | 0.835 |
| 1974.0 | 0.832 |
| 1974.0 | 0.944 |
| 1974.0 | 0.952 |
| 1975.0 | 0.979 |
| 1975.0 | 1.011 |
| 1975.0 | 0.914 |
| 1975.0 | 0.678 |
| 1975.0 | 0.646 |
| 1975.0 | 0.596 |
| 1975.0 | 0.621 |
| 1975.0 | 0.491 |
| 1975.0 | 0.408 |
| 1975.0 | 0.274 |
| 1975.0 | 0.386 |
| 1975.0 | 0.591 |
| 1976.0 | 0.552 |
| 1976.0 | 0.519 |
| 1976.0 | 0.553 |
| 1976.0 | 0.777 |
| 1976.0 | 0.712 |
| 1976.0 | 0.497 |
| 1976.0 | 0.424 |
| 1976.0 | 0.294 |
| 1976.0 | 0.048 |
| 1976.0 | -0.185 |
| 1976.0 | -0.401 |
| 1976.0 | -0.525 |
| 1977.0 | -0.531 |
| 1977.0 | -0.531 |
| 1977.0 | -0.333 |
| 1977.0 | -0.175 |
| 1977.0 | -0.273 |
| 1977.0 | -0.421 |
| 1977.0 | -0.331 |
| 1977.0 | -0.297 |
| 1977.0 | 0.146 |
| 1977.0 | 0.438 |
| 1977.0 | 0.484 |
| 1977.0 | 0.46 |
| 1978.0 | 0.519 |
| 1978.0 | 0.322 |
| 1978.0 | 0.258 |
| 1978.0 | 0.153 |
| 1978.0 | -0.01 |
| 1978.0 | 0.005 |
| 1978.0 | 0.063 |
| 1978.0 | 0.13 |
| 1978.0 | 0.244 |
| 1978.0 | 0.11 |
| 1978.0 | -0.139 |
| 1978.0 | -0.196 |
| 1979.0 | -0.235 |
| 1979.0 | -0.17 |
| 1979.0 | 0.028 |
| 1979.0 | 0.186 |
| 1979.0 | 0.482 |
| 1979.0 | 0.694 |
| 1979.0 | 0.588 |
| 1979.0 | 0.491 |
| 1979.0 | 0.441 |
| 1979.0 | 0.307 |
| 1979.0 | 0.419 |
| 1979.0 | 0.427 |
| 1980.0 | 0.486 |
| 1980.0 | 0.453 |
| 1980.0 | 0.323 |
| 1980.0 | 0.318 |
| 1980.0 | 0.121 |
| 1980.0 | -0.028 |
| 1980.0 | -0.134 |
| 1980.0 | -0.133 |
| 1980.0 | 0.048 |
| 1980.0 | 0.044 |
| 1980.0 | -0.04 |
| 1980.0 | -0.098 |
| 1981.0 | -0.17 |
| 1981.0 | -0.137 |
| 1981.0 | -0.038 |
| 1981.0 | 0.219 |
| 1981.0 | 0.154 |
| 1981.0 | 0.104 |
| 1981.0 | 0.03 |
| 1981.0 | -0.133 |
| 1981.0 | -0.412 |
| 1981.0 | -0.448 |
| 1981.0 | -0.401 |
| 1981.0 | -0.393 |
| 1982.0 | -0.301 |
| 1982.0 | -0.334 |
| 1982.0 | -0.333 |
| 1982.0 | -0.207 |
| 1982.0 | -0.01 |
| 1982.0 | -0.093 |
| 1982.0 | -0.003 |
| 1982.0 | 0.13 |
| 1982.0 | 0.146 |
| 1982.0 | 0.438 |
| 1982.0 | 0.648 |
| 1982.0 | 0.689 |
| 1983.0 | 0.782 |
| 1983.0 | 0.748 |
| 1983.0 | 0.783 |
| 1983.0 | 0.744 |
| 1983.0 | 0.515 |
| 1983.0 | 0.497 |
| 1983.0 | 0.457 |
| 1983.0 | 0.327 |
| 1983.0 | 0.244 |
| 1983.0 | 0.405 |
| 1983.0 | 0.452 |
| 1983.0 | 0.591 |
| 1984.0 | 0.552 |
| 1984.0 | 0.584 |
| 1984.0 | 0.553 |
| 1984.0 | 0.449 |
| 1984.0 | 0.449 |
| 1984.0 | 0.497 |
| 1984.0 | 0.49 |
| 1984.0 | 0.425 |
| 1984.0 | 0.31 |
| 1984.0 | 0.307 |
| 1984.0 | 0.353 |
| 1984.0 | 0.493 |
| 1985.0 | 0.519 |
| 1985.0 | 0.519 |
| 1985.0 | 0.586 |
| 1985.0 | 0.646 |
| 1985.0 | 0.744 |
| 1985.0 | 0.727 |
| 1985.0 | 0.785 |
| 1985.0 | 0.917 |
| 1985.0 | 1.065 |
| 1985.0 | 1.291 |
| 1985.0 | 1.37 |
| 1985.0 | 1.346 |
| 1986.0 | 1.241 |
| 1986.0 | 1.208 |
| 1986.0 | 1.242 |
| 1986.0 | 1.4 |
| 1986.0 | 1.269 |
| 1986.0 | 1.055 |
| 1986.0 | 1.015 |
| 1986.0 | 1.016 |
| 1986.0 | 0.901 |
| 1986.0 | 0.897 |
| 1986.0 | 0.911 |
| 1986.0 | 0.886 |
| 1987.0 | 0.847 |
| 1987.0 | 0.781 |
| 1987.0 | 0.684 |
| 1987.0 | 0.514 |
| 1987.0 | 0.219 |
| 1987.0 | 0.071 |
| 1987.0 | -0.003 |
| 1987.0 | 0.064 |
| 1987.0 | -0.018 |
| 1987.0 | -0.185 |
| 1987.0 | -0.237 |
| 1987.0 | -0.098 |
| 1988.0 | -0.104 |
| 1988.0 | -0.137 |
| 1988.0 | -0.202 |
| 1988.0 | -0.175 |
| 1988.0 | -0.371 |
| 1988.0 | -0.585 |
| 1988.0 | -0.757 |
| 1988.0 | -0.461 |
| 1988.0 | -0.313 |
| 1988.0 | -0.349 |
| 1988.0 | -0.04 |
| 1988.0 | 0.197 |
| 1989.0 | 0.29 |
| 1989.0 | 0.224 |
| 1989.0 | 0.159 |
| 1989.0 | 0.186 |
| 1989.0 | 0.121 |
| 1989.0 | 0.202 |
| 1989.0 | 0.096 |
| 1989.0 | -0.034 |
| 1989.0 | -0.117 |
| 1989.0 | -0.349 |
| 1989.0 | -0.303 |
| 1989.0 | -0.426 |
| 1990.0 | -0.432 |
| 1990.0 | -0.433 |
| 1990.0 | -0.464 |
| 1990.0 | -0.568 |
| 1990.0 | -0.568 |
| 1990.0 | -0.618 |
| 1990.0 | -0.495 |
| 1990.0 | -0.559 |
| 1990.0 | -0.51 |
| 1990.0 | -0.415 |
| 1990.0 | -0.303 |
| 1990.0 | -0.295 |
| 1991.0 | -0.301 |
| 1991.0 | -0.334 |
| 1991.0 | -0.3 |
| 1991.0 | -0.109 |
| 1991.0 | -0.109 |
| 1991.0 | -0.225 |
| 1991.0 | -0.134 |
| 1991.0 | -0.231 |
| 1991.0 | -0.313 |
| 1991.0 | -0.284 |
| 1991.0 | -0.04 |
| 1991.0 | 0.164 |
| 1992.0 | 0.158 |
| 1992.0 | 0.125 |
| 1992.0 | 0.061 |
| 1992.0 | -0.109 |
| 1992.0 | -0.109 |
| 1992.0 | -0.257 |
| 1992.0 | -0.167 |
| 1992.0 | -0.198 |
| 1992.0 | -0.051 |
| 1992.0 | 0.077 |
| 1992.0 | 0.091 |
| 1992.0 | 0.23 |
| 1993.0 | 0.29 |
| 1993.0 | 0.191 |
| 1993.0 | 0.028 |
| 1993.0 | -0.043 |
| 1993.0 | 0.088 |
| 1993.0 | 0.136 |
| 1993.0 | 0.194 |
| 1993.0 | 0.294 |
| 1993.0 | 0.277 |
| 1993.0 | 0.208 |
| 1993.0 | 0.156 |
| 1993.0 | 0.197 |
| 1994.0 | 0.224 |
| 1994.0 | 0.191 |
| 1994.0 | 0.159 |
| 1994.0 | 0.153 |
| 1994.0 | 0.154 |
| 1994.0 | 0.071 |
| 1994.0 | 0.096 |
| 1994.0 | 0.097 |
| 1994.0 | 0.179 |
| 1994.0 | 0.143 |
| 1994.0 | 0.091 |
| 1994.0 | 0.066 |
| 1995.0 | 0.027 |
| 1995.0 | -0.072 |
| 1995.0 | -0.136 |
| 1995.0 | -0.175 |
| 1995.0 | -0.305 |
| 1995.0 | -0.421 |
| 1995.0 | -0.429 |
| 1995.0 | -0.428 |
| 1995.0 | -0.313 |
| 1995.0 | -0.087 |
| 1995.0 | 0.025 |
| 1995.0 | 0.033 |
| 1996.0 | 0.06 |
| 1996.0 | 0.191 |
| 1996.0 | 0.225 |
| 1996.0 | 0.186 |
| 1996.0 | 0.351 |
| 1996.0 | 0.53 |
| 1996.0 | 0.654 |
| 1996.0 | 0.819 |
| 1996.0 | 0.802 |
| 1996.0 | 0.635 |
| 1996.0 | 0.648 |
| 1996.0 | 0.755 |
| 1997.0 | 0.88 |
| 1997.0 | 0.912 |
| 1997.0 | 0.914 |
| 1997.0 | 0.974 |
| 1997.0 | 0.941 |
| 1997.0 | 0.694 |
| 1997.0 | 0.719 |
| 1997.0 | 0.491 |
| 1997.0 | 0.31 |
| 1997.0 | 0.307 |
| 1997.0 | 0.288 |
| 1997.0 | 0.263 |
| 1998.0 | 0.257 |
| 1998.0 | 0.256 |
| 1998.0 | 0.192 |
| 1998.0 | 0.318 |
| 1998.0 | -0.043 |
| 1998.0 | -0.159 |
| 1998.0 | -0.298 |
| 1998.0 | -0.493 |
| 1998.0 | -0.674 |
| 1998.0 | -0.842 |
| 1998.0 | -0.861 |
| 1998.0 | -0.689 |
| 1999.0 | -0.662 |
| 1999.0 | -0.531 |
| 1999.0 | -0.563 |
| 1999.0 | -0.47 |
| 1999.0 | -0.502 |
| 1999.0 | -0.421 |
| 1999.0 | -0.232 |
| 1999.0 | -0.198 |
| 1999.0 | -0.313 |
| 1999.0 | -0.448 |
| 1999.0 | -0.5 |
| 1999.0 | -0.525 |
| 2000.0 | -0.531 |
| 2000.0 | -0.597 |
| 2000.0 | -0.497 |
| 2000.0 | -0.437 |
| 2000.0 | -0.634 |
| 2000.0 | -0.651 |
| 2000.0 | -0.56 |
| 2000.0 | -0.723 |
| 2000.0 | -0.871 |
| 2000.0 | -1.038 |
| 2000.0 | -1.058 |
| 2000.0 | -1.115 |
| 2001.0 | -1.121 |
| 2001.0 | -1.056 |
| 2001.0 | -1.055 |
| 2001.0 | -0.798 |
| 2001.0 | -0.371 |
| 2001.0 | -0.356 |
| 2001.0 | -0.462 |
| 2001.0 | -0.461 |
| 2001.0 | -0.543 |
| 2001.0 | -0.71 |
| 2001.0 | -0.598 |
| 2001.0 | -0.328 |
| 2002.0 | -0.334 |
| 2002.0 | -0.4 |
| 2002.0 | -0.399 |
| 2002.0 | -0.371 |
| 2002.0 | -0.305 |
| 2002.0 | -0.421 |
| 2002.0 | -0.462 |
| 2002.0 | -0.428 |
| 2002.0 | -0.379 |
| 2002.0 | -0.251 |
| 2002.0 | -0.369 |
| 2002.0 | -0.459 |
| 2003.0 | -0.531 |
| 2003.0 | -0.629 |
| 2003.0 | -0.661 |
| 2003.0 | -0.568 |
| 2003.0 | -0.568 |
| 2003.0 | -0.684 |
| 2003.0 | -0.79 |
| 2003.0 | -0.789 |
| 2003.0 | -0.871 |
| 2003.0 | -0.842 |
| 2003.0 | -0.795 |
| 2003.0 | -0.689 |
| 2004.0 | -0.596 |
| 2004.0 | -0.629 |
| 2004.0 | -0.53 |
| 2004.0 | -0.404 |
| 2004.0 | -0.404 |
| 2004.0 | -0.29 |
| 2004.0 | -0.331 |
| 2004.0 | -0.362 |
| 2004.0 | -0.248 |
| 2004.0 | -0.153 |
| 2004.0 | -0.04 |
| 2004.0 | -0.065 |
| 2005.0 | -0.006 |
| 2005.0 | 0.027 |
| 2005.0 | -0.038 |
| 2005.0 | 0.022 |
| 2005.0 | -0.141 |
| 2005.0 | -0.159 |
| 2005.0 | -0.265 |
| 2005.0 | -0.493 |
| 2005.0 | -0.609 |
| 2005.0 | -0.448 |
| 2005.0 | -0.401 |
| 2005.0 | -0.328 |
| 2006.0 | -0.268 |
| 2006.0 | -0.269 |
| 2006.0 | -0.366 |
| 2006.0 | -0.306 |
| 2006.0 | -0.371 |
| 2006.0 | -0.454 |
| 2006.0 | -0.626 |
| 2006.0 | -0.756 |
| 2006.0 | -1.101 |
| 2006.0 | -1.268 |
| 2006.0 | -1.418 |
| 2006.0 | -1.378 |
| 2007.0 | -1.318 |
| 2007.0 | -1.417 |
| 2007.0 | -1.448 |
| 2007.0 | -1.323 |
| 2007.0 | -1.585 |
| 2007.0 | -1.635 |
| 2007.0 | -1.643 |
| 2007.0 | -1.707 |
| 2007.0 | -1.691 |
| 2007.0 | -1.104 |
| 2007.0 | -0.959 |
| 2007.0 | -0.951 |
| 2008.0 | -0.793 |
| 2008.0 | -0.761 |
| 2008.0 | -0.858 |
| 2008.0 | -0.798 |
| 2008.0 | -0.568 |
| 2008.0 | -0.487 |
| 2008.0 | -0.298 |
| 2008.0 | -0.362 |
| 2008.0 | -0.543 |
| 2008.0 | -0.645 |
| 2008.0 | -0.664 |
| 2008.0 | -0.689 |
| 2009.0 | -0.596 |
| 2009.0 | -0.531 |
| 2009.0 | -0.464 |
| 2009.0 | -0.437 |
| 2009.0 | -0.371 |
| 2009.0 | -0.454 |
| 2009.0 | -0.527 |
| 2009.0 | -0.461 |
| 2009.0 | -0.379 |
| 2009.0 | -0.513 |
| 2009.0 | -0.401 |
| 2009.0 | -0.328 |
| 2010.0 | -0.367 |
| 2010.0 | -0.4 |
| 2010.0 | -0.464 |
| 2010.0 | -0.568 |
| 2010.0 | -0.896 |
| 2010.0 | -1.012 |
| 2010.0 | -1.02 |
| 2010.0 | -1.084 |
| 2010.0 | -1.035 |
| 2010.0 | -1.071 |
| 2010.0 | -1.09 |
| 2010.0 | -1.082 |
| 2011.0 | -1.056 |
| 2011.0 | -1.089 |
| 2011.0 | -1.186 |
| 2011.0 | -1.126 |
| 2011.0 | -1.027 |
| 2011.0 | -0.946 |
| 2011.0 | -0.823 |
| 2011.0 | -0.821 |
| 2011.0 | -1.002 |
| 2011.0 | -1.006 |
| 2011.0 | -1.025 |
| 2011.0 | -1.017 |
| 2012.0 | -1.023 |
| 2012.0 | -1.056 |
| 2012.0 | -0.989 |
| 2012.0 | -0.831 |
| 2012.0 | -0.962 |
| 2012.0 | -0.782 |
| 2012.0 | -0.659 |
| 2012.0 | -0.854 |
| 2012.0 | -1.101 |
| 2012.0 | -1.301 |
| 2012.0 | -1.222 |
| 2012.0 | -1.148 |
| 2013.0 | -1.121 |
| 2013.0 | -1.056 |
| 2013.0 | -1.088 |
| 2013.0 | -1.093 |
| 2013.0 | -0.798 |
| 2013.0 | -0.585 |
| 2013.0 | -0.429 |
| 2013.0 | -0.297 |
| 2013.0 | -0.182 |
| 2013.0 | -0.218 |
| 2013.0 | -0.237 |
| 2013.0 | -0.164 |
| 2014.0 | -0.104 |
| 2014.0 | -0.072 |
| 2014.0 | -0.005 |
| 2014.0 | 0.055 |
| 2014.0 | 0.384 |
| 2014.0 | 0.563 |